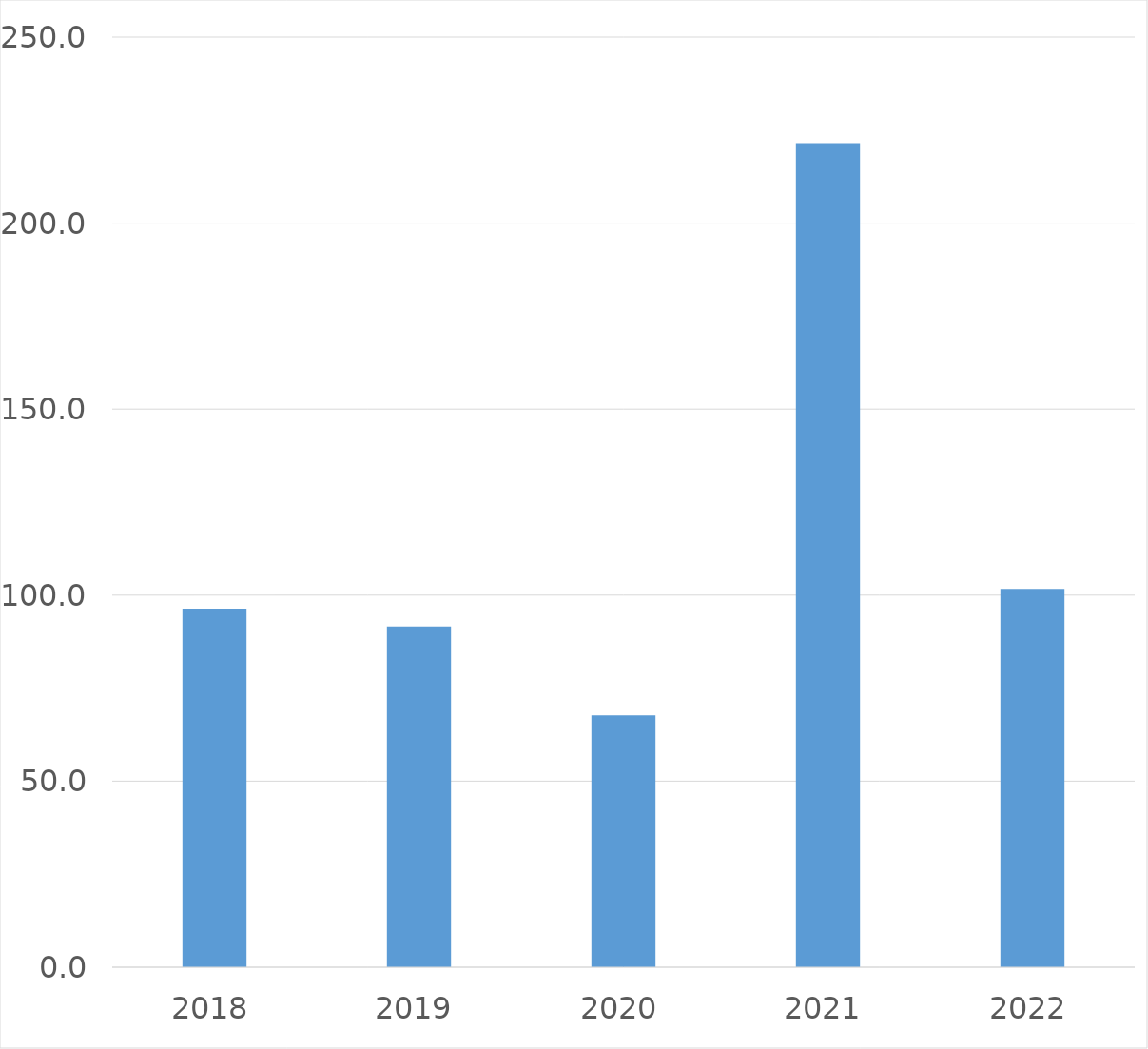
| Category | Series 0 |
|---|---|
| 2018 | 96.4 |
| 2019 | 91.6 |
| 2020 | 67.7 |
| 2021 | 221.5 |
| 2022 | 101.7 |